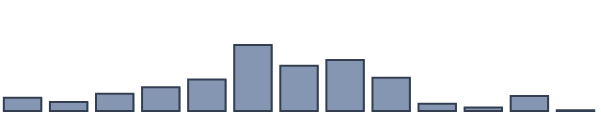
| Category | Series 0 |
|---|---|
| 0 | 4.2 |
| 1 | 2.8 |
| 2 | 5.4 |
| 3 | 7.5 |
| 4 | 9.9 |
| 5 | 20.8 |
| 6 | 14.3 |
| 7 | 16.1 |
| 8 | 10.5 |
| 9 | 2.3 |
| 10 | 1.1 |
| 11 | 4.7 |
| 12 | 0.2 |